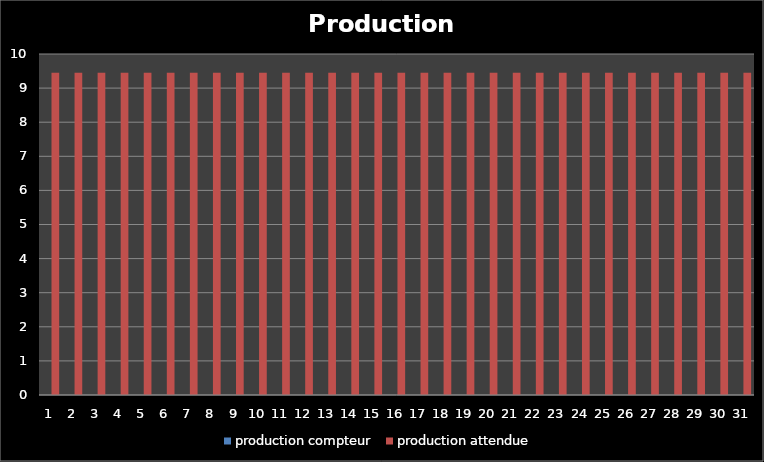
| Category | production compteur | production attendue |
|---|---|---|
| 1.0 | 0 | 9.452 |
| 2.0 | 0 | 9.452 |
| 3.0 | 0 | 9.452 |
| 4.0 | 0 | 9.452 |
| 5.0 | 0 | 9.452 |
| 6.0 | 0 | 9.452 |
| 7.0 | 0 | 9.452 |
| 8.0 | 0 | 9.452 |
| 9.0 | 0 | 9.452 |
| 10.0 | 0 | 9.452 |
| 11.0 | 0 | 9.452 |
| 12.0 | 0 | 9.452 |
| 13.0 | 0 | 9.452 |
| 14.0 | 0 | 9.452 |
| 15.0 | 0 | 9.452 |
| 16.0 | 0 | 9.452 |
| 17.0 | 0 | 9.452 |
| 18.0 | 0 | 9.452 |
| 19.0 | 0 | 9.452 |
| 20.0 | 0 | 9.452 |
| 21.0 | 0 | 9.452 |
| 22.0 | 0 | 9.452 |
| 23.0 | 0 | 9.452 |
| 24.0 | 0 | 9.452 |
| 25.0 | 0 | 9.452 |
| 26.0 | 0 | 9.452 |
| 27.0 | 0 | 9.452 |
| 28.0 | 0 | 9.452 |
| 29.0 | 0 | 9.452 |
| 30.0 | 0 | 9.452 |
| 31.0 | 0 | 9.452 |